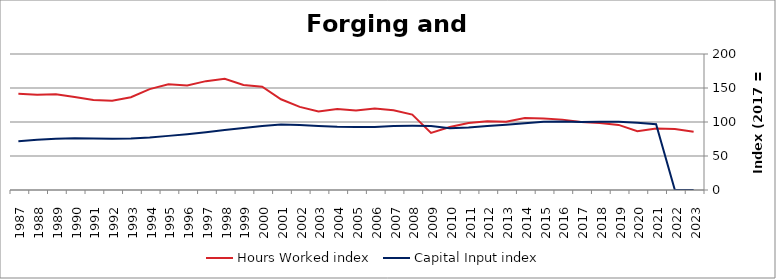
| Category | Hours Worked index | Capital Input index |
|---|---|---|
| 2023.0 | 85.573 | 0 |
| 2022.0 | 89.641 | 0 |
| 2021.0 | 90.602 | 96.682 |
| 2020.0 | 86.36 | 98.805 |
| 2019.0 | 95.76 | 100.344 |
| 2018.0 | 98.693 | 100.291 |
| 2017.0 | 100 | 100 |
| 2016.0 | 103.493 | 100.707 |
| 2015.0 | 105.122 | 100.458 |
| 2014.0 | 105.907 | 98.234 |
| 2013.0 | 100.509 | 95.879 |
| 2012.0 | 101.259 | 94.019 |
| 2011.0 | 98.457 | 91.924 |
| 2010.0 | 92.596 | 90.682 |
| 2009.0 | 83.898 | 94.247 |
| 2008.0 | 110.922 | 94.412 |
| 2007.0 | 117.126 | 94.249 |
| 2006.0 | 119.695 | 92.575 |
| 2005.0 | 116.761 | 92.536 |
| 2004.0 | 119.191 | 92.879 |
| 2003.0 | 115.32 | 94.278 |
| 2002.0 | 122.242 | 95.592 |
| 2001.0 | 133.453 | 96.394 |
| 2000.0 | 151.902 | 94.166 |
| 1999.0 | 154.471 | 91.04 |
| 1998.0 | 163.432 | 88.259 |
| 1997.0 | 160.081 | 84.957 |
| 1996.0 | 153.863 | 82.061 |
| 1995.0 | 155.545 | 79.596 |
| 1994.0 | 148.417 | 77.37 |
| 1993.0 | 136.384 | 75.899 |
| 1992.0 | 131.368 | 75.206 |
| 1991.0 | 132.459 | 75.854 |
| 1990.0 | 136.809 | 76.004 |
| 1989.0 | 140.893 | 75.19 |
| 1988.0 | 140.129 | 73.752 |
| 1987.0 | 141.401 | 71.602 |